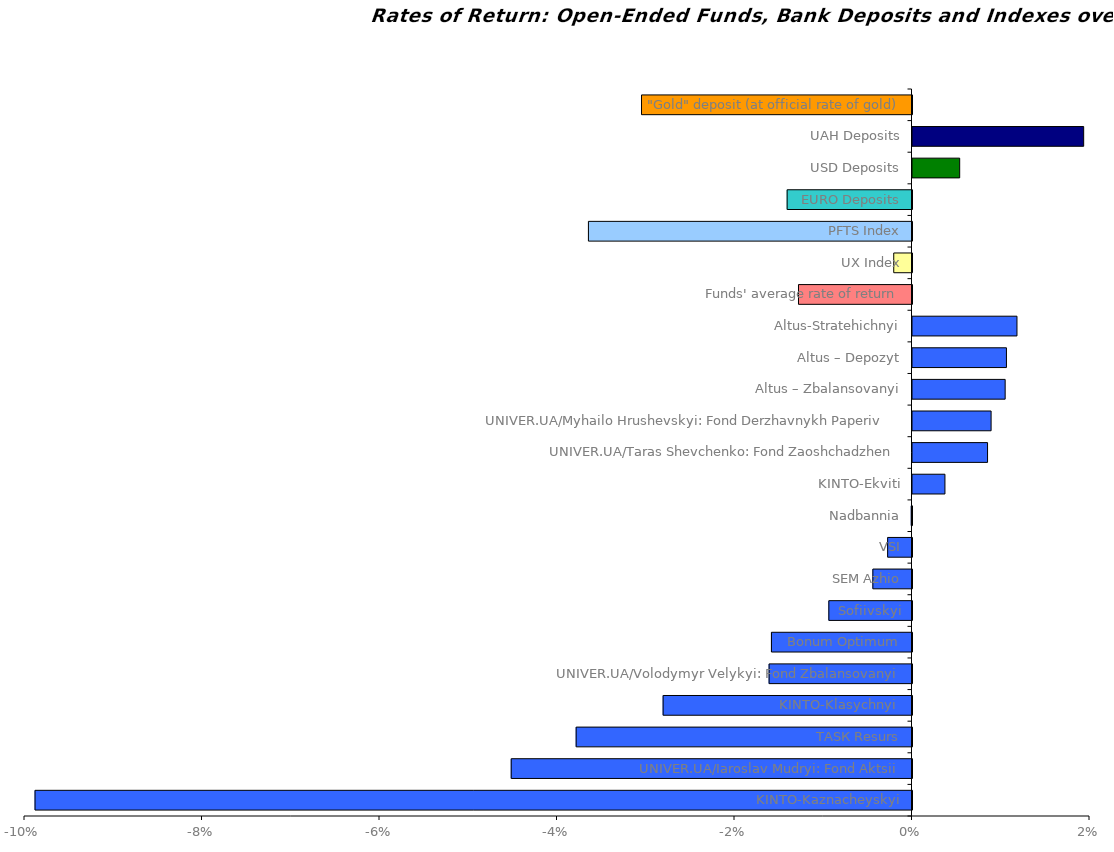
| Category | Series 0 |
|---|---|
| KINTO-Kaznacheyskyi | -0.099 |
| UNIVER.UA/Iaroslav Mudryi: Fond Aktsii | -0.045 |
| ТАSК Resurs | -0.038 |
| KINTO-Klasychnyi  | -0.028 |
| UNIVER.UA/Volodymyr Velykyi: Fond Zbalansovanyi | -0.016 |
| Bonum Optimum | -0.016 |
| Sofiivskyi | -0.009 |
| SEM Azhio | -0.004 |
| VSI | -0.003 |
| Nadbannia | 0 |
| KINTO-Ekviti | 0.004 |
| UNIVER.UA/Taras Shevchenko: Fond Zaoshchadzhen | 0.008 |
| UNIVER.UA/Myhailo Hrushevskyi: Fond Derzhavnykh Paperiv    | 0.009 |
| Altus – Zbalansovanyi | 0.01 |
| Altus – Depozyt | 0.011 |
| Altus-Stratehichnyi | 0.012 |
| Funds' average rate of return | -0.013 |
| UX Index | -0.002 |
| PFTS Index | -0.036 |
| EURO Deposits | -0.014 |
| USD Deposits | 0.005 |
| UAH Deposits | 0.019 |
| "Gold" deposit (at official rate of gold) | -0.03 |